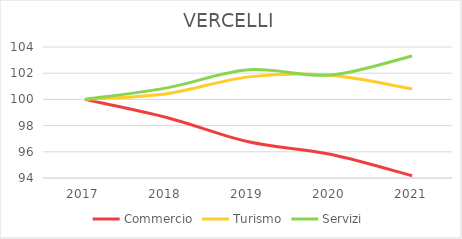
| Category | Commercio | Turismo | Servizi |
|---|---|---|---|
| 2017.0 | 100 | 100 | 100 |
| 2018.0 | 98.622 | 100.43 | 100.879 |
| 2019.0 | 96.766 | 101.72 | 102.261 |
| 2020.0 | 95.808 | 101.843 | 101.859 |
| 2021.0 | 94.17 | 100.799 | 103.317 |